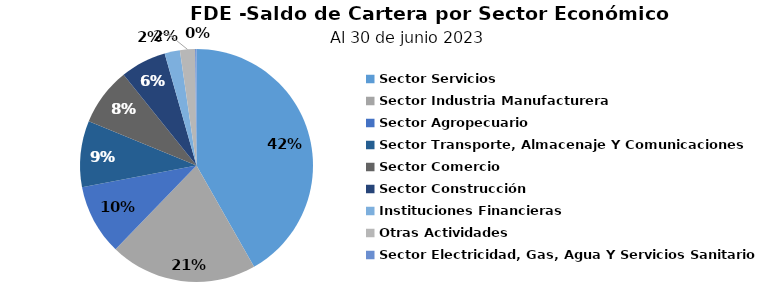
| Category | Saldo |
|---|---|
| Sector Servicios | 21.25 |
| Sector Industria Manufacturera | 10.406 |
| Sector Agropecuario | 4.979 |
| Sector Transporte, Almacenaje Y Comunicaciones | 4.676 |
| Sector Comercio | 4.082 |
| Sector Construcción | 3.234 |
| Instituciones Financieras | 1.081 |
| Otras Actividades | 1.062 |
| Sector Electricidad, Gas, Agua Y Servicios Sanitarios | 0.1 |